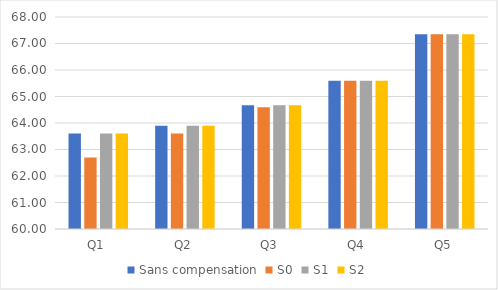
| Category | Sans compensation | S0 | S1 | S2 |
|---|---|---|---|---|
| Q1 | 63.6 | 62.7 | 63.6 | 63.6 |
| Q2 | 63.9 | 63.6 | 63.9 | 63.9 |
| Q3 | 64.67 | 64.595 | 64.67 | 64.67 |
| Q4 | 65.59 | 65.59 | 65.59 | 65.59 |
| Q5 | 67.35 | 67.35 | 67.35 | 67.35 |